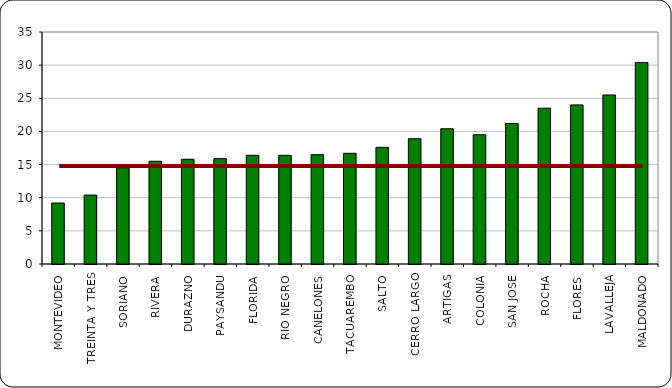
| Category | 2012 |
|---|---|
| MONTEVIDEO | 9.2 |
| TREINTA Y TRES | 10.4 |
| SORIANO | 14.5 |
| RIVERA | 15.5 |
| DURAZNO | 15.8 |
| PAYSANDU | 15.9 |
| FLORIDA | 16.4 |
| RIO NEGRO | 16.4 |
| CANELONES | 16.5 |
| TACUAREMBÓ | 16.7 |
| SALTO | 17.6 |
| CERRO LARGO | 18.9 |
| ARTIGAS | 20.4 |
| COLONIA | 19.5 |
| SAN JOSE | 21.2 |
| ROCHA | 23.5 |
| FLORES | 24 |
| LAVALLEJA | 25.5 |
| MALDONADO | 30.4 |